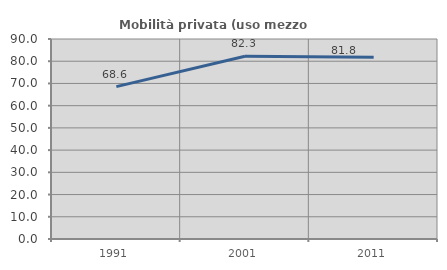
| Category | Mobilità privata (uso mezzo privato) |
|---|---|
| 1991.0 | 68.555 |
| 2001.0 | 82.274 |
| 2011.0 | 81.753 |